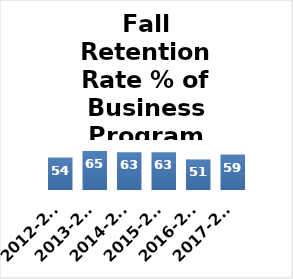
| Category | Series 0 |
|---|---|
| 2012-2013 (n=166) | 54 |
| 2013-2014 (n=165) | 65 |
| 2014-2015 (n=174) | 63 |
| 2015-2016 (n=199) | 63 |
| 2016-2017 (n=144) | 51 |
| 2017-2018 (n=146) | 59 |